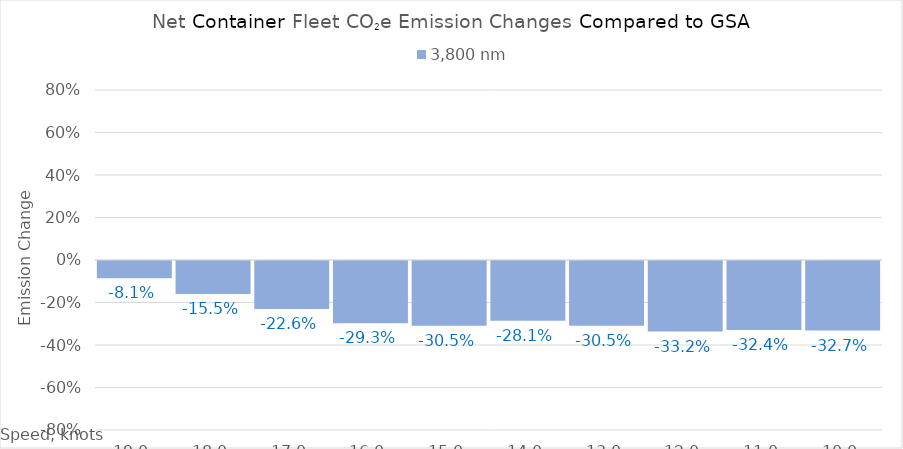
| Category | 3,800 |
|---|---|
| 19.0 | -0.081 |
| 18.0 | -0.155 |
| 17.0 | -0.226 |
| 16.0 | -0.293 |
| 15.0 | -0.305 |
| 14.0 | -0.281 |
| 13.0 | -0.305 |
| 12.0 | -0.332 |
| 11.0 | -0.324 |
| 10.0 | -0.327 |